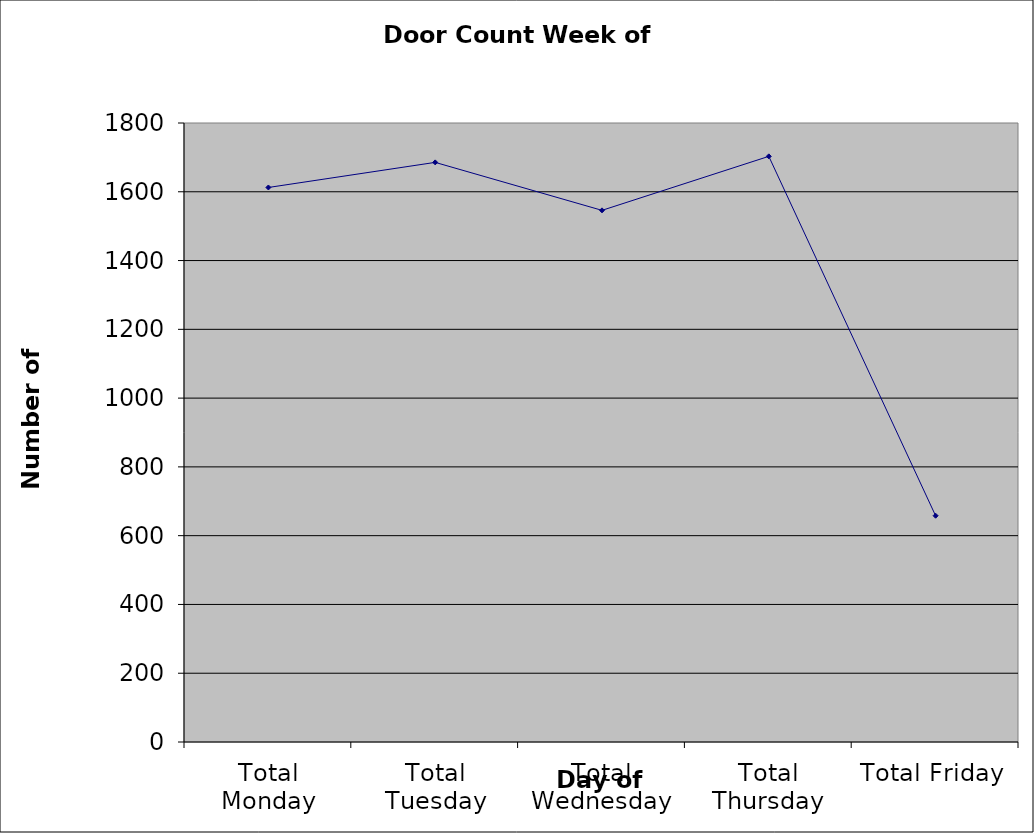
| Category | Series 0 |
|---|---|
| Total Monday | 1612.5 |
| Total Tuesday | 1685.5 |
| Total Wednesday | 1546 |
| Total Thursday | 1703 |
| Total Friday | 658 |